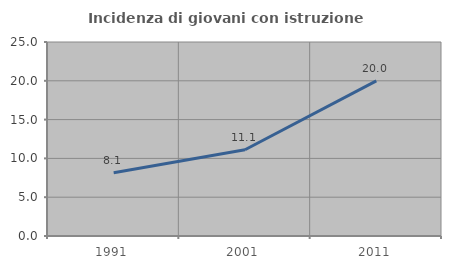
| Category | Incidenza di giovani con istruzione universitaria |
|---|---|
| 1991.0 | 8.14 |
| 2001.0 | 11.111 |
| 2011.0 | 20 |